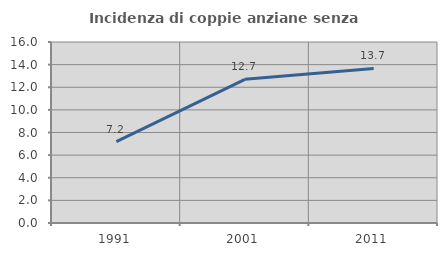
| Category | Incidenza di coppie anziane senza figli  |
|---|---|
| 1991.0 | 7.2 |
| 2001.0 | 12.704 |
| 2011.0 | 13.663 |